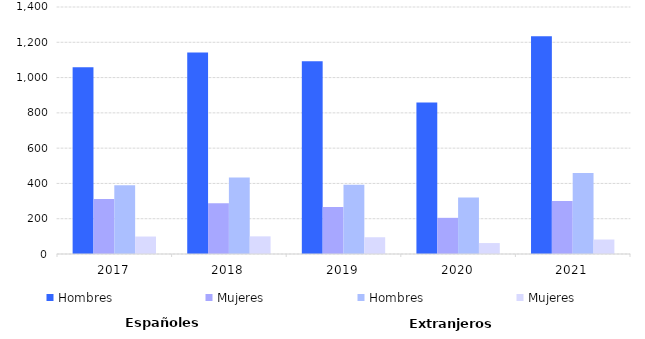
| Category | Hombres | Mujeres |
|---|---|---|
| 2017 | 389 | 99 |
| 2018 | 434 | 100 |
| 2019 | 392 | 95 |
| 2020 | 320 | 62 |
| 2021 | 459 | 82 |